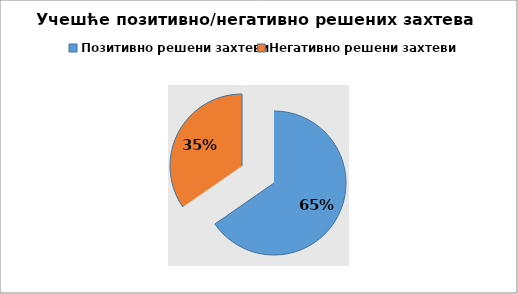
| Category | Series 0 |
|---|---|
| Позитивно решени захтеви | 16569 |
| Негативно решени захтеви | 8788 |